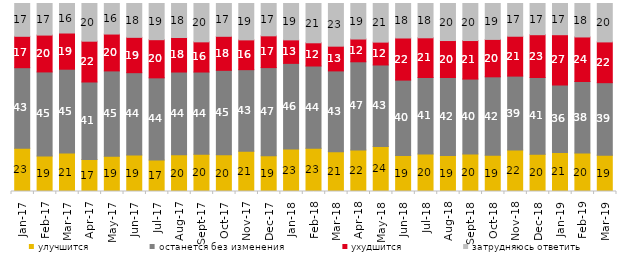
| Category | улучшится | останется без изменения | ухудшится | затрудняюсь ответить |
|---|---|---|---|---|
| 2017-01-01 | 23 | 42.85 | 16.7 | 17.45 |
| 2017-02-01 | 18.85 | 44.75 | 19.6 | 16.8 |
| 2017-03-01 | 20.5 | 44.55 | 19.25 | 15.7 |
| 2017-04-01 | 17 | 41.25 | 21.7 | 20.05 |
| 2017-05-01 | 18.7 | 45.45 | 19.6 | 16.25 |
| 2017-06-01 | 19.4 | 43.8 | 18.8 | 18 |
| 2017-07-01 | 16.7 | 43.75 | 20.3 | 19.25 |
| 2017-08-01 | 19.5 | 44.05 | 18.35 | 18.1 |
| 2017-09-01 | 19.8 | 43.75 | 16.05 | 20.4 |
| 2017-10-01 | 19.55 | 44.9 | 18.1 | 17.45 |
| 2017-11-01 | 21.45 | 43.35 | 15.85 | 19.35 |
| 2017-12-01 | 18.95 | 46.95 | 16.9 | 17.2 |
| 2018-01-01 | 22.55 | 45.6 | 12.5 | 19.35 |
| 2018-02-01 | 23 | 43.75 | 12.35 | 20.9 |
| 2018-03-01 | 21.15 | 43 | 13.15 | 22.7 |
| 2018-04-01 | 22.05 | 46.95 | 12.1 | 18.9 |
| 2018-05-01 | 23.95 | 43.35 | 12.15 | 20.55 |
| 2018-06-01 | 19.15 | 40.1 | 22.4 | 18.35 |
| 2018-07-01 | 19.95 | 40.7 | 21.1 | 18.25 |
| 2018-08-01 | 19.15 | 41.5 | 19.65 | 19.7 |
| 2018-09-01 | 19.95 | 39.85 | 20.5 | 19.7 |
| 2018-10-01 | 19.3 | 41.7 | 19.9 | 19.1 |
| 2018-11-01 | 22.056 | 39.321 | 21.208 | 17.415 |
| 2018-12-01 | 19.8 | 40.85 | 22.75 | 16.6 |
| 2019-01-01 | 20.75 | 35.95 | 26.7 | 16.6 |
| 2019-02-01 | 20.45 | 38.05 | 23.7 | 17.8 |
| 2019-03-01 | 19.344 | 38.538 | 21.681 | 20.438 |